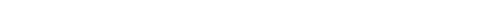
| Category | Series 0 | Series 1 |
|---|---|---|
| nan | 94.7 | 93.93 |
| 1.0 | 93.2 | 93.59 |
| 1.0 | 92.9 | 93.51 |
| 1.0 | 94.1 | 93.81 |
| nan | 94.2 | 94.16 |
| 2.0 | 94 | 94.12 |
| 2.0 | 94.3 | 93.74 |
| 2.0 | 93.1 | 93.29 |
| nan | 92.9 | 93.08 |
| 3.0 | 93.1 | 93.21 |
| 3.0 | 93.6 | 93.35 |
| 3.0 | 93.2 | 93.2 |
| nan | 92.6 | 92.73 |
| 4.0 | 92.6 | 92.23 |
| 4.0 | 91.5 | 91.95 |
| 4.0 | 92.3 | 92.17 |
| nan | 92.4 | 92.92 |
| 5.0 | 94.1 | 93.73 |
| 5.0 | 94 | 94.17 |
| 5.0 | 93.8 | 94.12 |
| nan | 94 | 93.74 |
| 6.0 | 93 | 93.28 |
| 6.0 | 92.9 | 92.94 |
| 6.0 | 92.9 | 92.78 |
| nan | 92.6 | 92.63 |
| 7.0 | 92.5 | 92.41 |
| 7.0 | 92.1 | 92.2 |
| 7.0 | 92.4 | 91.97 |
| nan | 92 | 91.82 |
| 8.0 | 91.3 | 91.78 |
| 8.0 | 92.4 | 91.71 |
| 8.0 | 90.9 | 91.5 |
| nan | 91.2 | 91.13 |
| 9.0 | 91 | 90.73 |
| 9.0 | 90.1 | 90.49 |
| 9.0 | 90.7 | 90.56 |
| nan | 91.1 | 90.95 |
| 10.0 | 91.2 | 91.36 |
| 10.0 | 91.7 | 91.52 |
| 10.0 | 91.6 | 91.39 |
| nan | 90.9 | 91.05 |
| 11.0 | 90.9 | 90.66 |
| 11.0 | 90 | 90.27 |
| 11.0 | 90 | 89.77 |
| nan | 88.7 | 89.21 |
| 12.0 | 88.6 | 88.75 |
| 12.0 | 88.6 | 88.5 |
| 12.0 | 88.2 | 88.57 |
| nan | 88.8 | 88.75 |
| 13.0 | 89.2 | 88.88 |
| 13.0 | 88.7 | 88.89 |
| 13.0 | 88.8 | 88.73 |
| nan | 88.5 | 88.36 |
| 14.0 | 87.4 | 87.83 |
| 14.0 | 87.7 | 87.36 |
| 14.0 | 87.1 | 87.18 |
| nan | 87.1 | 87.25 |
| 15.0 | 87.7 | 87.44 |
| 15.0 | 87.1 | 87.55 |
| 15.0 | 87.7 | 87.43 |
| nan | 87.1 | 87.2 |
| 16.0 | 87 | 87.07 |
| 16.0 | 87.4 | 87 |
| 16.0 | 87 | 86.84 |
| nan | 86.8 | 86.57 |
| 17.0 | 86.2 | 86.33 |
| 17.0 | 86.5 | 86.22 |
| 17.0 | 86.3 | 86.25 |
| nan | 86 | 86.33 |
| 18.0 | 86.6 | 86.4 |
| 18.0 | 86 | 86.41 |
| 18.0 | 86 | 86.33 |
| nan | 86.2 | 86.08 |
| 19.0 | 85.5 | 85.57 |
| 19.0 | 84.8 | 84.91 |
| 19.0 | 84.3 | 84.42 |
| nan | 83.7 | 83.68 |